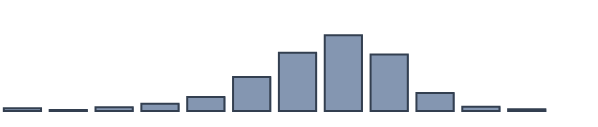
| Category | Series 0 |
|---|---|
| 0 | 0.957 |
| 1 | 0.391 |
| 2 | 1.391 |
| 3 | 2.609 |
| 4 | 5.087 |
| 5 | 12.261 |
| 6 | 21 |
| 7 | 27.261 |
| 8 | 20.348 |
| 9 | 6.478 |
| 10 | 1.565 |
| 11 | 0.652 |
| 12 | 0 |